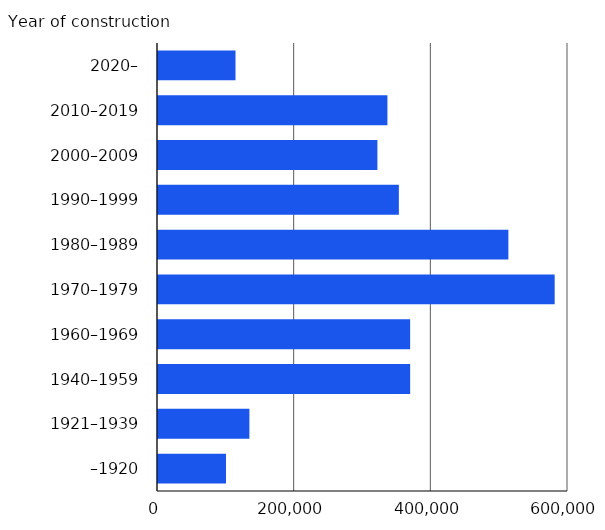
| Category | Number of dwellings |
|---|---|
| –1920 | 99510 |
| 1921–1939 | 133747 |
| 1940–1959 | 369012 |
| 1960–1969 | 368981 |
| 1970–1979 | 580485 |
| 1980–1989 | 512761 |
| 1990–1999 | 352478 |
| 2000–2009 | 321082 |
| 2010–2019 | 335730 |
| 2020– | 113424 |